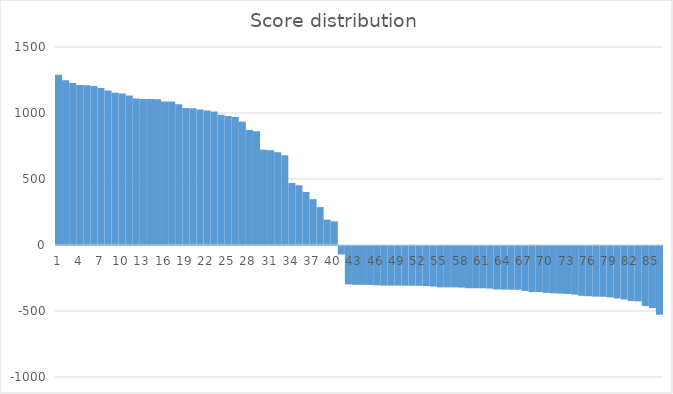
| Category | Series 0 |
|---|---|
| 0 | 1289.9 |
| 1 | 1249 |
| 2 | 1226.5 |
| 3 | 1211.8 |
| 4 | 1210.7 |
| 5 | 1204.7 |
| 6 | 1189.3 |
| 7 | 1171.2 |
| 8 | 1152.6 |
| 9 | 1146.9 |
| 10 | 1132.6 |
| 11 | 1110.6 |
| 12 | 1106.7 |
| 13 | 1105.4 |
| 14 | 1103.5 |
| 15 | 1087.7 |
| 16 | 1087.5 |
| 17 | 1065.8 |
| 18 | 1038.4 |
| 19 | 1035.1 |
| 20 | 1026.1 |
| 21 | 1019.1 |
| 22 | 1011 |
| 23 | 986.8 |
| 24 | 978.2 |
| 25 | 969.1 |
| 26 | 934.9 |
| 27 | 872 |
| 28 | 862.1 |
| 29 | 722.2 |
| 30 | 718.4 |
| 31 | 703.1 |
| 32 | 679.6 |
| 33 | 469.5 |
| 34 | 452.4 |
| 35 | 401.9 |
| 36 | 347.4 |
| 37 | 287.2 |
| 38 | 191.5 |
| 39 | 178.9 |
| 40 | -64.1 |
| 41 | -291.1 |
| 42 | -293.9 |
| 43 | -294.3 |
| 44 | -294.9 |
| 45 | -297.7 |
| 46 | -299.8 |
| 47 | -300.1 |
| 48 | -300.1 |
| 49 | -300.6 |
| 50 | -301 |
| 51 | -301.4 |
| 52 | -303.7 |
| 53 | -306.7 |
| 54 | -313.4 |
| 55 | -313.4 |
| 56 | -313.5 |
| 57 | -315.2 |
| 58 | -319.9 |
| 59 | -320.2 |
| 60 | -320.3 |
| 61 | -322.6 |
| 62 | -329.2 |
| 63 | -330.2 |
| 64 | -331.1 |
| 65 | -331.4 |
| 66 | -340.5 |
| 67 | -349.5 |
| 68 | -349.5 |
| 69 | -355.4 |
| 70 | -358.2 |
| 71 | -360.4 |
| 72 | -363.3 |
| 73 | -367.8 |
| 74 | -377.5 |
| 75 | -380.4 |
| 76 | -383.8 |
| 77 | -384.6 |
| 78 | -389 |
| 79 | -397.3 |
| 80 | -406 |
| 81 | -417.4 |
| 82 | -419.4 |
| 83 | -454.9 |
| 84 | -470.2 |
| 85 | -520.7 |